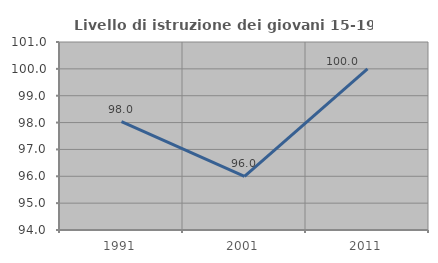
| Category | Livello di istruzione dei giovani 15-19 anni |
|---|---|
| 1991.0 | 98.039 |
| 2001.0 | 96 |
| 2011.0 | 100 |